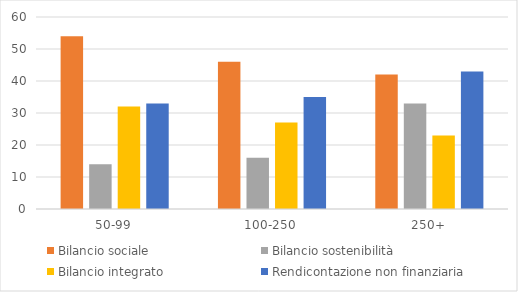
| Category | Bilancio sociale | Bilancio sostenibilità | Bilancio integrato | Rendicontazione non finanziaria |
|---|---|---|---|---|
| 50-99 | 54 | 14 | 32 | 33 |
| 100-250 | 46 | 16 | 27 | 35 |
| 250+ | 42 | 33 | 23 | 43 |